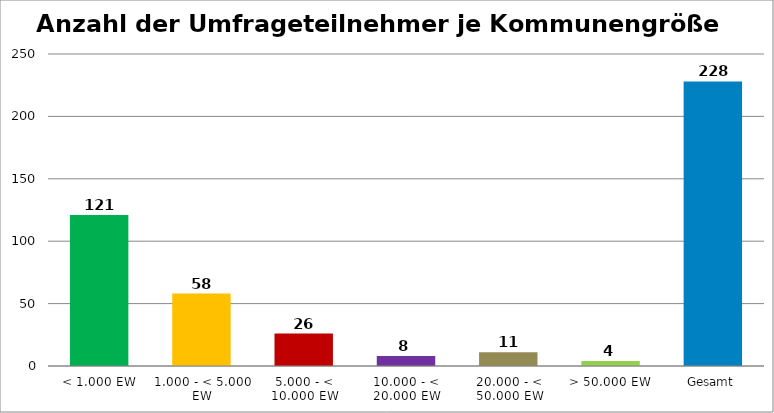
| Category | Series 0 |
|---|---|
| < 1.000 EW | 121 |
| 1.000 - < 5.000 EW | 58 |
| 5.000 - < 10.000 EW | 26 |
| 10.000 - < 20.000 EW | 8 |
| 20.000 - < 50.000 EW | 11 |
| > 50.000 EW | 4 |
| Gesamt | 228 |